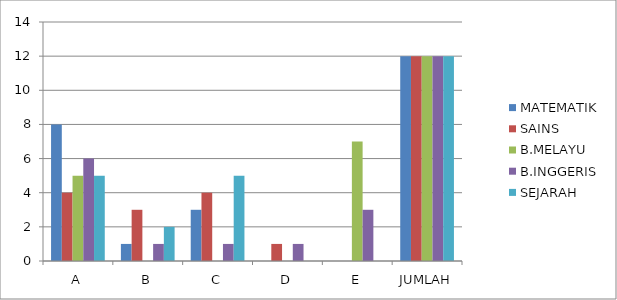
| Category | MATEMATIK | SAINS | B.MELAYU | B.INGGERIS | SEJARAH |
|---|---|---|---|---|---|
| A | 8 | 4 | 5 | 6 | 5 |
| B | 1 | 3 | 0 | 1 | 2 |
| C | 3 | 4 | 0 | 1 | 5 |
| D | 0 | 1 | 0 | 1 | 0 |
| E | 0 | 0 | 7 | 3 | 0 |
| JUMLAH | 12 | 12 | 12 | 12 | 12 |